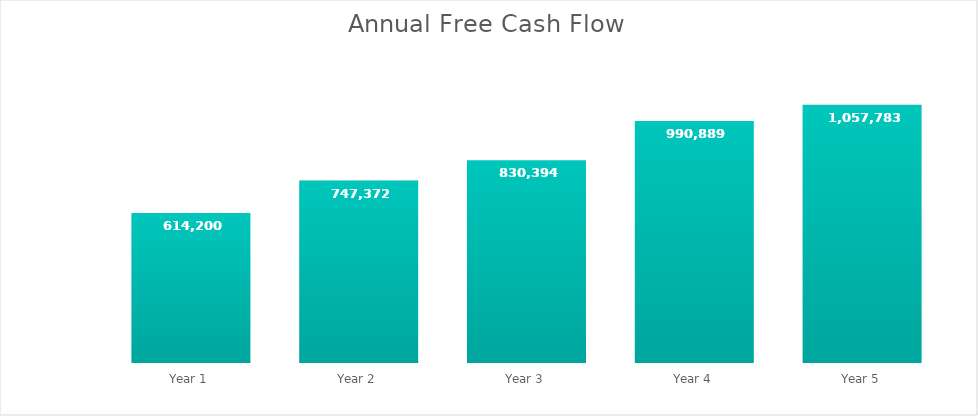
| Category | Cash Flow |
|---|---|
|  Year 1  | 614200 |
|  Year 2  | 747372 |
|  Year 3  | 830394.32 |
|  Year 4  | 990889.036 |
|  Year 5  | 1057783.488 |